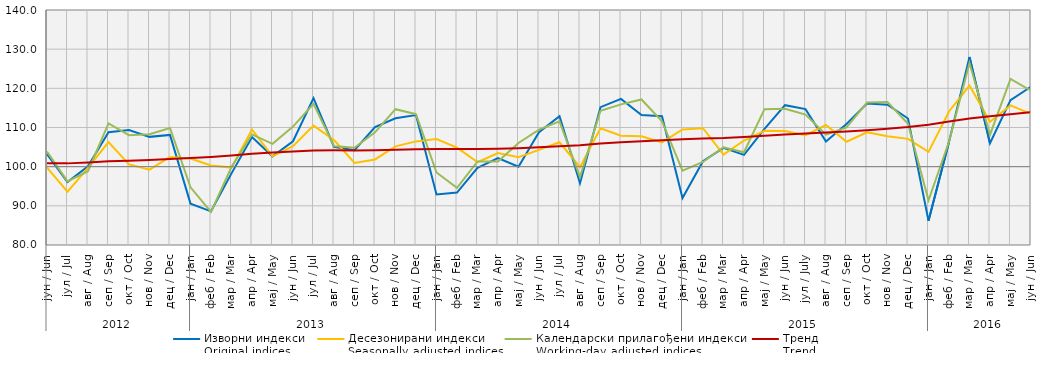
| Category | Изворни индекси
Original indices | Десезонирани индекси
Seasonally adjusted indices | Календарски прилагођени индекси
Working-day adjusted indices | Тренд
Trend |
|---|---|---|---|---|
| 0 | 103.214 | 99.737 | 103.847 | 100.841 |
| 1 | 96.046 | 93.594 | 96.242 | 100.84 |
| 2 | 100.071 | 99.669 | 98.855 | 101.068 |
| 3 | 108.809 | 106.263 | 111.05 | 101.358 |
| 4 | 109.371 | 100.571 | 108.042 | 101.516 |
| 5 | 107.609 | 99.236 | 108.269 | 101.694 |
| 6 | 108.112 | 102.475 | 109.89 | 101.956 |
| 7 | 90.559 | 102.071 | 94.713 | 102.223 |
| 8 | 88.596 | 100.298 | 88.454 | 102.489 |
| 9 | 98.288 | 99.767 | 99.904 | 102.865 |
| 10 | 107.567 | 109.453 | 108.226 | 103.295 |
| 11 | 102.635 | 102.643 | 105.822 | 103.598 |
| 12 | 106.478 | 105.227 | 110.233 | 103.882 |
| 13 | 117.488 | 110.485 | 116.059 | 104.129 |
| 14 | 105.073 | 106.802 | 105.288 | 104.17 |
| 15 | 104.198 | 100.947 | 104.837 | 104.127 |
| 16 | 110.096 | 101.846 | 108.758 | 104.185 |
| 17 | 112.368 | 105.174 | 114.683 | 104.333 |
| 18 | 113.169 | 106.452 | 113.4 | 104.461 |
| 19 | 92.9 | 107.059 | 98.518 | 104.521 |
| 20 | 93.4 | 104.854 | 94.6 | 104.497 |
| 21 | 99.7 | 101.169 | 101.322 | 104.48 |
| 22 | 102.2 | 103.485 | 101.326 | 104.564 |
| 23 | 100 | 102.427 | 106.046 | 104.717 |
| 24 | 108.8 | 104.299 | 109.473 | 104.953 |
| 25 | 112.9 | 106.224 | 111.572 | 105.203 |
| 26 | 95.8 | 99.889 | 97.355 | 105.486 |
| 27 | 115.2 | 109.813 | 114.285 | 105.894 |
| 28 | 117.3 | 107.911 | 115.903 | 106.251 |
| 29 | 113.2 | 107.746 | 117.16 | 106.514 |
| 30 | 112.9 | 106.192 | 111.568 | 106.767 |
| 31 | 92 | 109.497 | 98.975 | 107.026 |
| 32 | 101.4 | 109.809 | 101.198 | 107.209 |
| 33 | 104.8 | 103.087 | 104.968 | 107.341 |
| 34 | 103 | 106.673 | 103.675 | 107.593 |
| 35 | 109.651 | 109.174 | 114.681 | 107.912 |
| 36 | 115.698 | 109.092 | 114.758 | 108.188 |
| 37 | 114.7 | 108.025 | 113.286 | 108.459 |
| 38 | 106.4 | 110.629 | 108.177 | 108.725 |
| 39 | 110.9 | 106.356 | 110.024 | 108.98 |
| 40 | 116.1 | 108.762 | 116.371 | 109.297 |
| 41 | 115.8 | 107.788 | 116.525 | 109.681 |
| 42 | 112.3 | 107.095 | 110.941 | 110.124 |
| 43 | 86.2 | 103.77 | 91.401 | 110.727 |
| 44 | 106.3 | 114.085 | 106.36 | 111.558 |
| 45 | 128 | 120.712 | 126.455 | 112.321 |
| 46 | 106 | 111.476 | 108.172 | 112.868 |
| 47 | 117 | 115.638 | 122.392 | 113.402 |
| 48 | 120.4 | 113.469 | 119.386 | 113.921 |